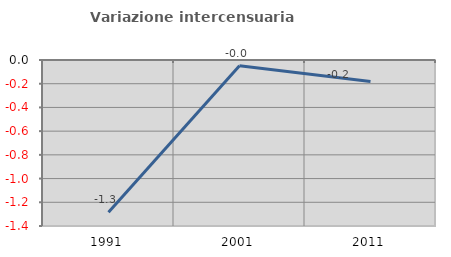
| Category | Variazione intercensuaria annua |
|---|---|
| 1991.0 | -1.284 |
| 2001.0 | -0.048 |
| 2011.0 | -0.182 |